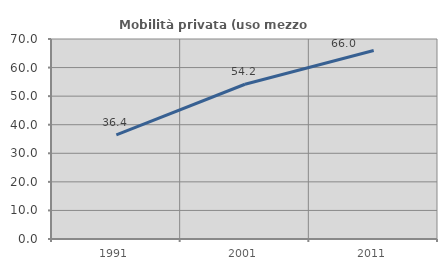
| Category | Mobilità privata (uso mezzo privato) |
|---|---|
| 1991.0 | 36.443 |
| 2001.0 | 54.156 |
| 2011.0 | 65.976 |